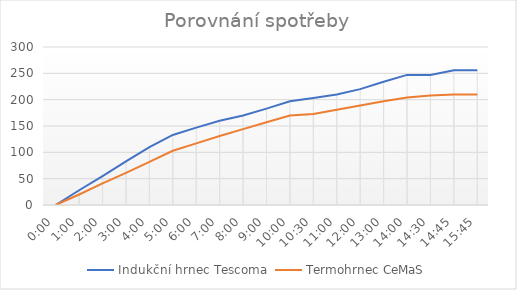
| Category | Indukční hrnec Tescoma | Termohrnec CeMaS |
|---|---|---|
| 0.0 | 0 | 0 |
| 0.041666666666666664 | 28 | 20 |
| 0.08333333333333333 | 55 | 41 |
| 0.125 | 83 | 61 |
| 0.16666666666666666 | 110 | 82 |
| 0.208333333333333 | 133 | 103 |
| 0.25 | 147 | 117 |
| 0.291666666666667 | 160 | 131 |
| 0.333333333333333 | 170 | 144 |
| 0.375 | 183 | 157 |
| 0.416666666666667 | 197 | 170 |
| 0.4375 | 203 | 173 |
| 0.458333333333333 | 210 | 181 |
| 0.5 | 220 | 189 |
| 0.541666666666667 | 234 | 197 |
| 0.583333333333333 | 247 | 204 |
| 0.6041666666666666 | 247 | 208 |
| 0.6145833333333334 | 256 | 210 |
| 0.65625 | 256 | 210 |